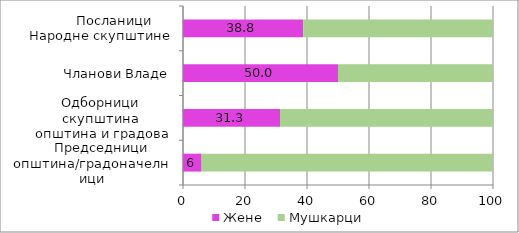
| Category | Жене | Мушкарци |
|---|---|---|
|      Председници
општина/градоначелници | 6 | 94 |
| Одборници скупштина
 општина и градова | 31.3 | 68.7 |
| Чланови Владе | 50 | 50 |
|         Посланици
Народне скупштине | 38.8 | 61.2 |